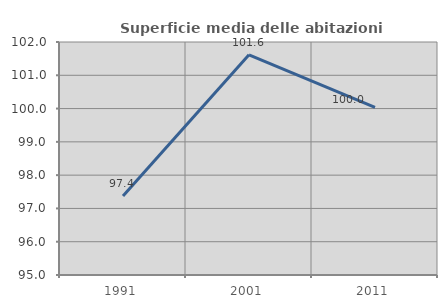
| Category | Superficie media delle abitazioni occupate |
|---|---|
| 1991.0 | 97.37 |
| 2001.0 | 101.615 |
| 2011.0 | 100.034 |